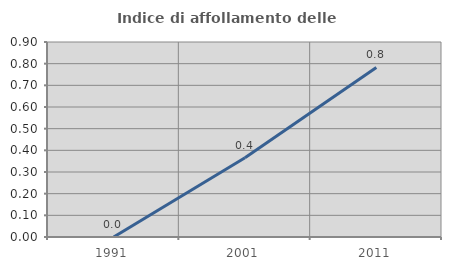
| Category | Indice di affollamento delle abitazioni  |
|---|---|
| 1991.0 | 0 |
| 2001.0 | 0.366 |
| 2011.0 | 0.783 |